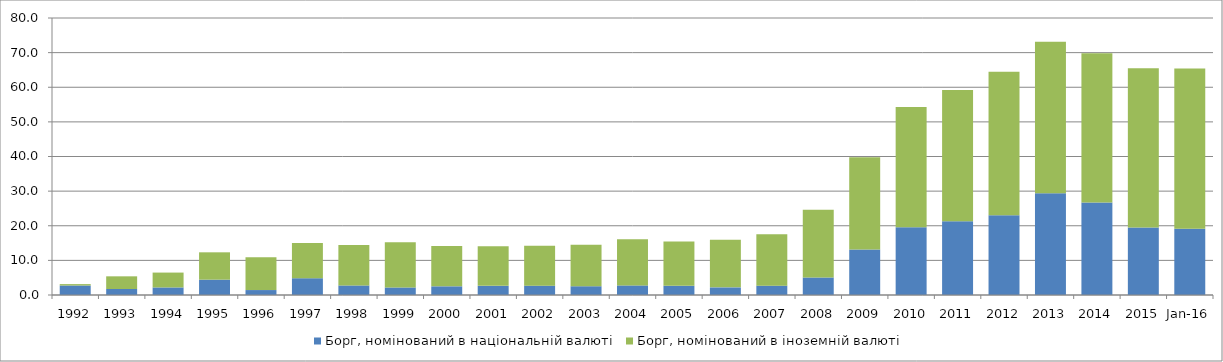
| Category | Борг, номінований в національній валюті | Борг, номінований в іноземній валюті |
|---|---|---|
| 1992.0 | 2.743 | 0.404 |
| 1993.0 | 1.732 | 3.661 |
| 1994.0 | 2.184 | 4.292 |
| 1995.0 | 4.433 | 7.895 |
| 1996.0 | 1.427 | 9.468 |
| 1997.0 | 4.845 | 10.164 |
| 1998.0 | 2.759 | 11.647 |
| 1999.0 | 2.176 | 13.072 |
| 2000.0 | 2.507 | 11.657 |
| 2001.0 | 2.65 | 11.419 |
| 2002.0 | 2.694 | 11.508 |
| 2003.0 | 2.533 | 12.01 |
| 2004.0 | 2.766 | 13.331 |
| 2005.0 | 2.666 | 12.809 |
| 2006.0 | 2.205 | 13.745 |
| 2007.0 | 2.69 | 14.883 |
| 2008.0 | 5.06 | 19.539 |
| 2009.0 | 13.143 | 26.67 |
| 2010.0 | 19.538 | 34.76 |
| 2011.0 | 21.329 | 37.894 |
| 2012.0 | 23.046 | 41.449 |
| 2013.0 | 29.397 | 43.765 |
| 2014.0 | 26.747 | 43.065 |
| 2015.0 | 19.515 | 45.973 |
| 42400.0 | 19.144 | 46.266 |